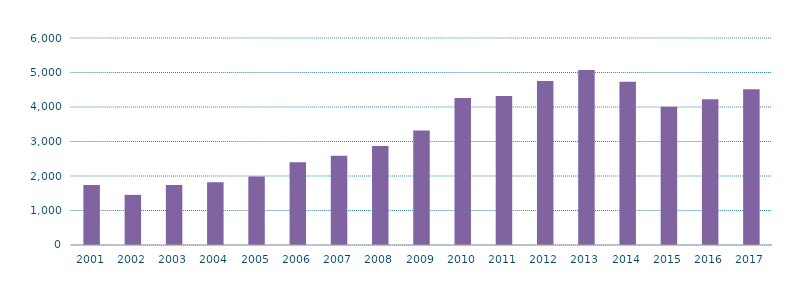
| Category | Nacional |
|---|---|
| 2001.0 | 1738.458 |
| 2002.0 | 1453.015 |
| 2003.0 | 1737.042 |
| 2004.0 | 1818.094 |
| 2005.0 | 1987.858 |
| 2006.0 | 2400.806 |
| 2007.0 | 2588.968 |
| 2008.0 | 2868.708 |
| 2009.0 | 3317.342 |
| 2010.0 | 4259.901 |
| 2011.0 | 4317.99 |
| 2012.0 | 4754.77 |
| 2013.0 | 5074.696 |
| 2014.0 | 4729.801 |
| 2015.0 | 4010.582 |
| 2016.0 | 4228.055 |
| 2017.0 | 4511.508 |